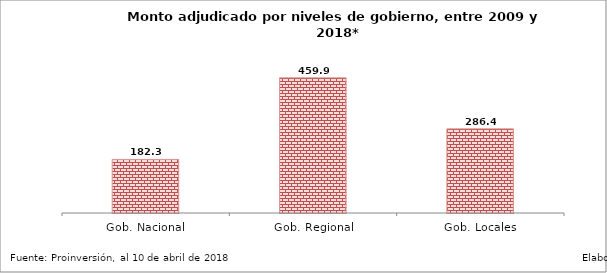
| Category | Series 0 |
|---|---|
| Gob. Nacional | 182.254 |
| Gob. Regional | 459.883 |
| Gob. Locales | 286.375 |